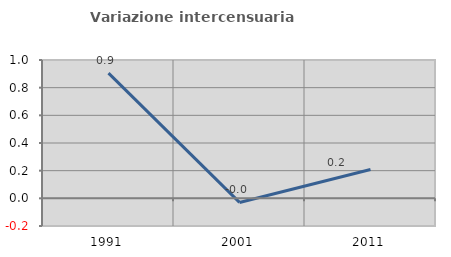
| Category | Variazione intercensuaria annua |
|---|---|
| 1991.0 | 0.905 |
| 2001.0 | -0.03 |
| 2011.0 | 0.209 |